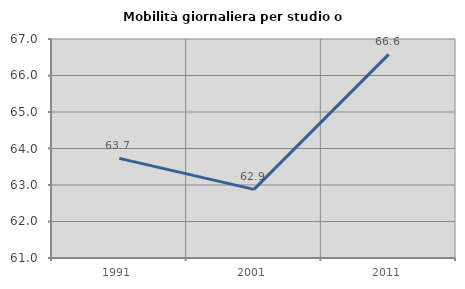
| Category | Mobilità giornaliera per studio o lavoro |
|---|---|
| 1991.0 | 63.729 |
| 2001.0 | 62.88 |
| 2011.0 | 66.578 |